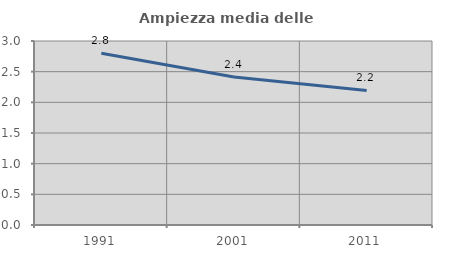
| Category | Ampiezza media delle famiglie |
|---|---|
| 1991.0 | 2.799 |
| 2001.0 | 2.412 |
| 2011.0 | 2.193 |